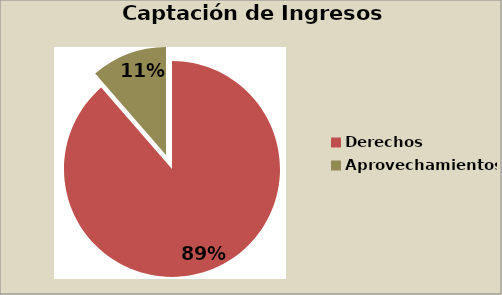
| Category | Series 0 |
|---|---|
| Derechos | 88.409 |
| Aprovechamientos | 11.354 |